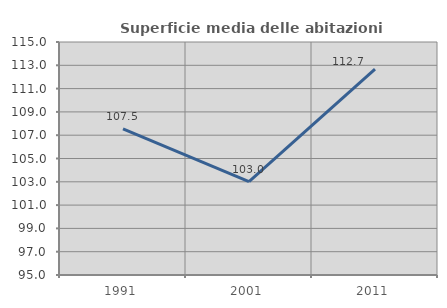
| Category | Superficie media delle abitazioni occupate |
|---|---|
| 1991.0 | 107.536 |
| 2001.0 | 103.011 |
| 2011.0 | 112.669 |